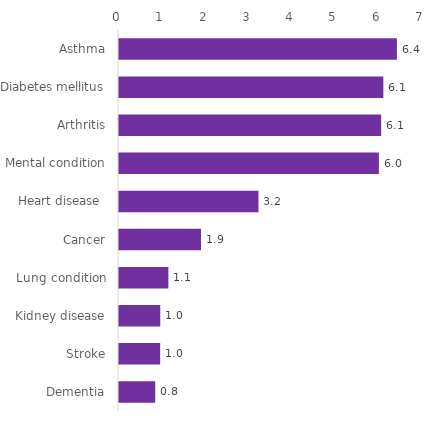
| Category | Series 0 |
|---|---|
| Asthma | 6.42 |
| Diabetes mellitus | 6.107 |
| Arthritis | 6.057 |
| Mental condition | 6.004 |
| Heart disease  | 3.222 |
| Cancer | 1.894 |
| Lung condition | 1.141 |
| Kidney disease | 0.953 |
| Stroke | 0.951 |
| Dementia | 0.837 |